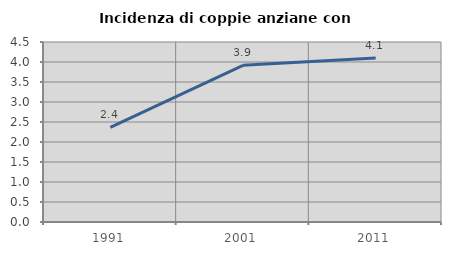
| Category | Incidenza di coppie anziane con figli |
|---|---|
| 1991.0 | 2.364 |
| 2001.0 | 3.916 |
| 2011.0 | 4.098 |